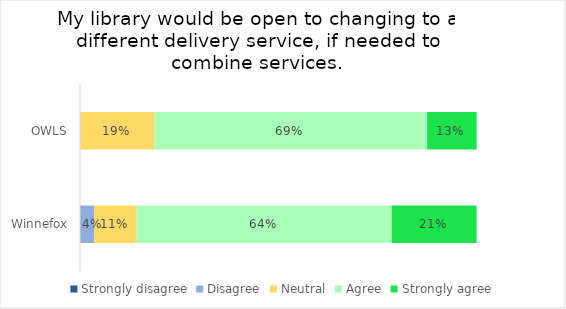
| Category | Strongly disagree | Disagree | Neutral | Agree | Strongly agree |
|---|---|---|---|---|---|
| OWLS | 0 | 0 | 0.188 | 0.688 | 0.125 |
| Winnefox | 0 | 0.036 | 0.107 | 0.643 | 0.214 |